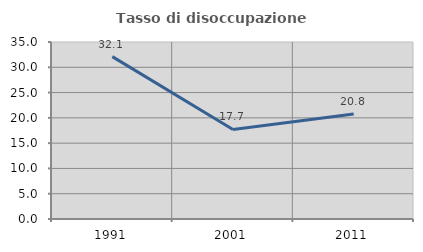
| Category | Tasso di disoccupazione giovanile  |
|---|---|
| 1991.0 | 32.107 |
| 2001.0 | 17.703 |
| 2011.0 | 20.765 |